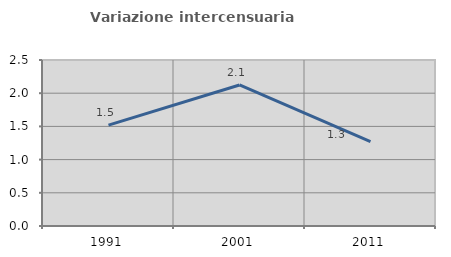
| Category | Variazione intercensuaria annua |
|---|---|
| 1991.0 | 1.52 |
| 2001.0 | 2.124 |
| 2011.0 | 1.271 |